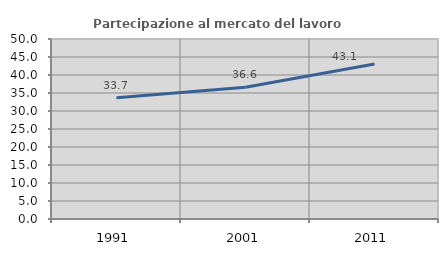
| Category | Partecipazione al mercato del lavoro  femminile |
|---|---|
| 1991.0 | 33.683 |
| 2001.0 | 36.588 |
| 2011.0 | 43.057 |